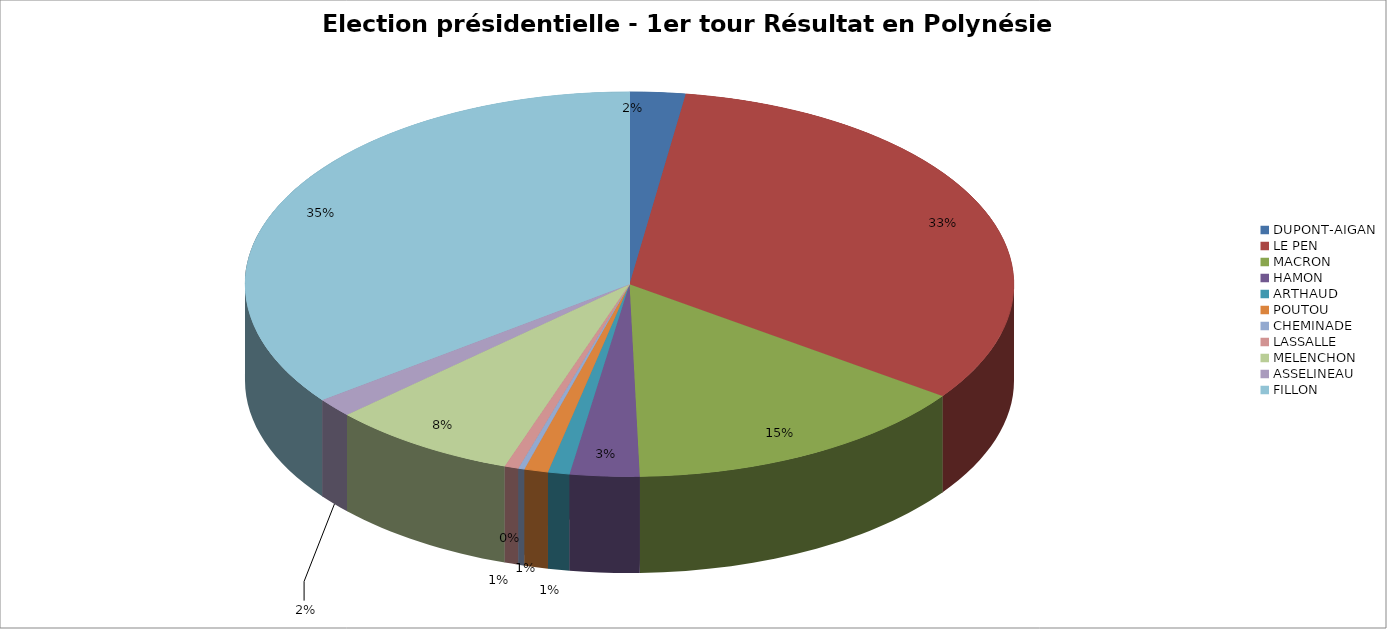
| Category | Series 0 |
|---|---|
| DUPONT-AIGAN | 0.023 |
| LE PEN | 0.325 |
| MACRON | 0.147 |
| HAMON | 0.029 |
| ARTHAUD | 0.009 |
| POUTOU | 0.01 |
| CHEMINADE | 0.003 |
| LASSALLE | 0.006 |
| MELENCHON | 0.079 |
| ASSELINEAU | 0.016 |
| FILLON | 0.353 |